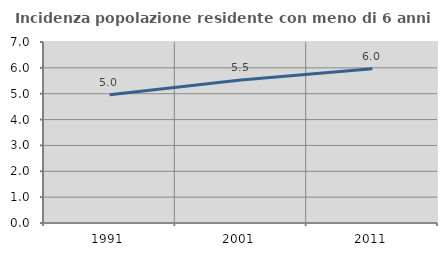
| Category | Incidenza popolazione residente con meno di 6 anni |
|---|---|
| 1991.0 | 4.964 |
| 2001.0 | 5.528 |
| 2011.0 | 5.961 |